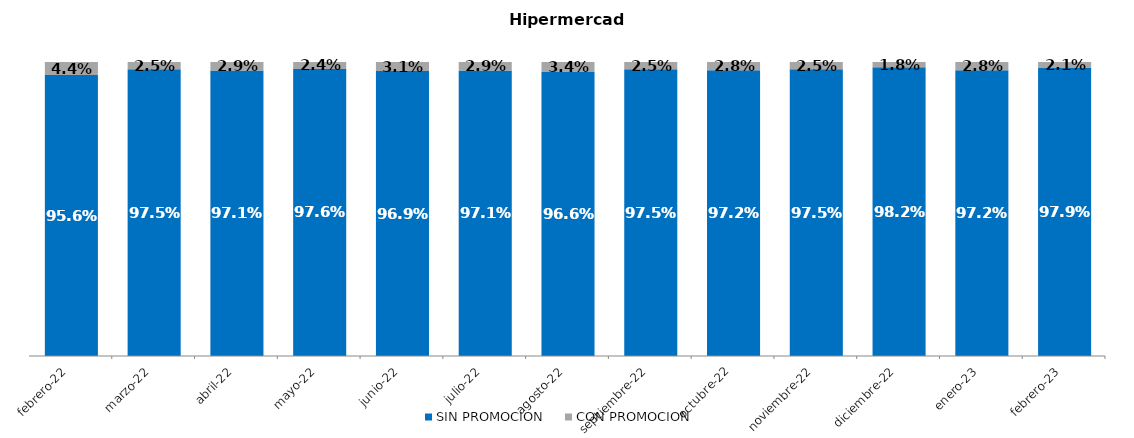
| Category | SIN PROMOCION   | CON PROMOCION   |
|---|---|---|
| 2022-02-01 | 0.956 | 0.044 |
| 2022-03-01 | 0.975 | 0.025 |
| 2022-04-01 | 0.971 | 0.029 |
| 2022-05-01 | 0.976 | 0.024 |
| 2022-06-01 | 0.969 | 0.031 |
| 2022-07-01 | 0.971 | 0.029 |
| 2022-08-01 | 0.966 | 0.034 |
| 2022-09-01 | 0.975 | 0.025 |
| 2022-10-01 | 0.972 | 0.028 |
| 2022-11-01 | 0.975 | 0.025 |
| 2022-12-01 | 0.982 | 0.018 |
| 2023-01-01 | 0.972 | 0.028 |
| 2023-02-01 | 0.979 | 0.021 |